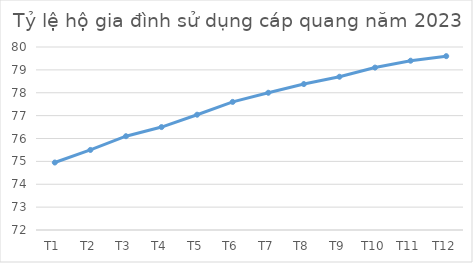
| Category | Series 0 |
|---|---|
| T1 | 74.95 |
| T2 | 75.5 |
| T3 | 76.1 |
| T4 | 76.5 |
| T5 | 77.04 |
| T6 | 77.6 |
| T7 | 78 |
| T8 | 78.38 |
| T9 | 78.7 |
| T10 | 79.1 |
| T11 | 79.4 |
| T12 | 79.6 |